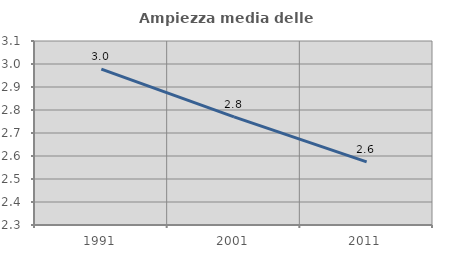
| Category | Ampiezza media delle famiglie |
|---|---|
| 1991.0 | 2.978 |
| 2001.0 | 2.77 |
| 2011.0 | 2.575 |